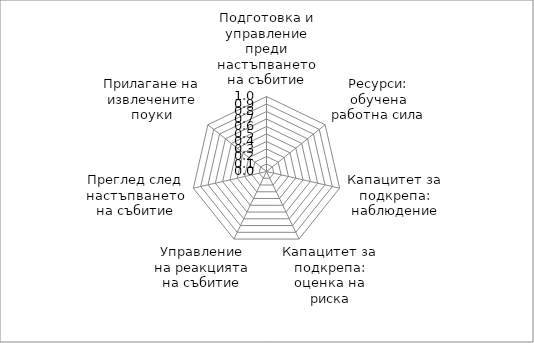
| Category | Series 0 |
|---|---|
| Подготовка и управление преди настъпването на събитие | 0 |
| Ресурси: обучена работна сила | 0 |
| Капацитет за подкрепа: наблюдение | 0 |
| Капацитет за подкрепа: оценка на риска | 0 |
| Управление на реакцията на събитие | 0 |
| Преглед след настъпването на събитие | 0 |
| Прилагане на извлечените поуки | 0 |